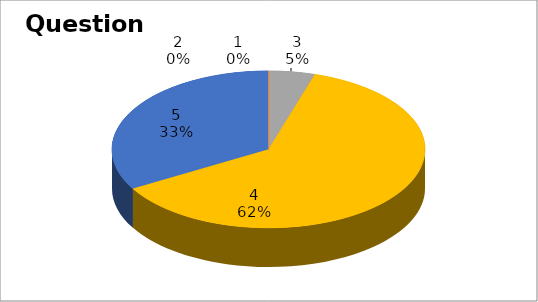
| Category | Series 0 |
|---|---|
| 0 | 0 |
| 1 | 0 |
| 2 | 1 |
| 3 | 13 |
| 4 | 7 |